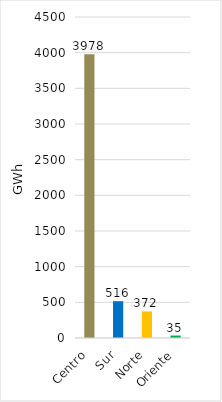
| Category | Series 0 |
|---|---|
| Centro | 3978.347 |
| Sur | 516.092 |
| Norte | 372.295 |
| Oriente | 34.752 |